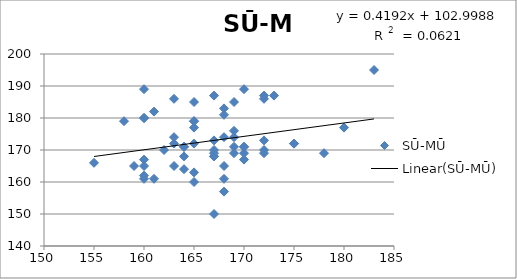
| Category | SŪ-MŪ |
|---|---|
| 170.0 | 171 |
| 164.0 | 168 |
| 160.0 | 162 |
| 161.0 | 161 |
| 168.0 | 161 |
| 169.0 | 174 |
| 165.0 | 160 |
| 165.0 | 185 |
| 161.0 | 182 |
| 163.0 | 174 |
| 167.0 | 169 |
| 167.0 | 170 |
| 162.0 | 170 |
| 165.0 | 172 |
| 155.0 | 166 |
| 167.0 | 168 |
| 163.0 | 165 |
| 165.0 | 163 |
| 180.0 | 177 |
| 169.0 | 176 |
| 175.0 | 172 |
| 163.0 | 172 |
| 159.0 | 165 |
| 172.0 | 169 |
| 167.0 | 173 |
| 175.0 | 172 |
| 169.0 | 171 |
| 160.0 | 167 |
| 168.0 | 183 |
| 168.0 | 165 |
| 170.0 | 167 |
| 167.0 | 150 |
| 178.0 | 169 |
| 160.0 | 180 |
| 168.0 | 181 |
| 158.0 | 179 |
| 160.0 | 189 |
| 163.0 | 186 |
| 170.0 | 189 |
| 160.0 | 180 |
| 183.0 | 195 |
| 172.0 | 187 |
| 165.0 | 179 |
| 164.0 | 164 |
| 170.0 | 169 |
| 170.0 | 171 |
| 168.0 | 174 |
| 160.0 | 161 |
| 173.0 | 187 |
| 167.0 | 187 |
| 165.0 | 179 |
| 169.0 | 185 |
| 164.0 | 171 |
| 168.0 | 157 |
| 172.0 | 186 |
| 160.0 | 165 |
| 172.0 | 173 |
| 165.0 | 177 |
| 172.0 | 170 |
| 167.0 | 168 |
| 169.0 | 169 |
| 164.0 | 171 |